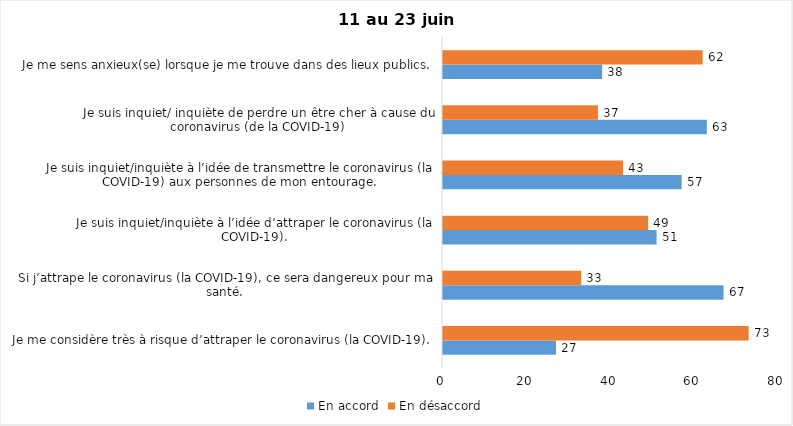
| Category | En accord | En désaccord |
|---|---|---|
| Je me considère très à risque d’attraper le coronavirus (la COVID-19). | 27 | 73 |
| Si j’attrape le coronavirus (la COVID-19), ce sera dangereux pour ma santé. | 67 | 33 |
| Je suis inquiet/inquiète à l’idée d’attraper le coronavirus (la COVID-19). | 51 | 49 |
| Je suis inquiet/inquiète à l’idée de transmettre le coronavirus (la COVID-19) aux personnes de mon entourage. | 57 | 43 |
| Je suis inquiet/ inquiète de perdre un être cher à cause du coronavirus (de la COVID-19) | 63 | 37 |
| Je me sens anxieux(se) lorsque je me trouve dans des lieux publics. | 38 | 62 |